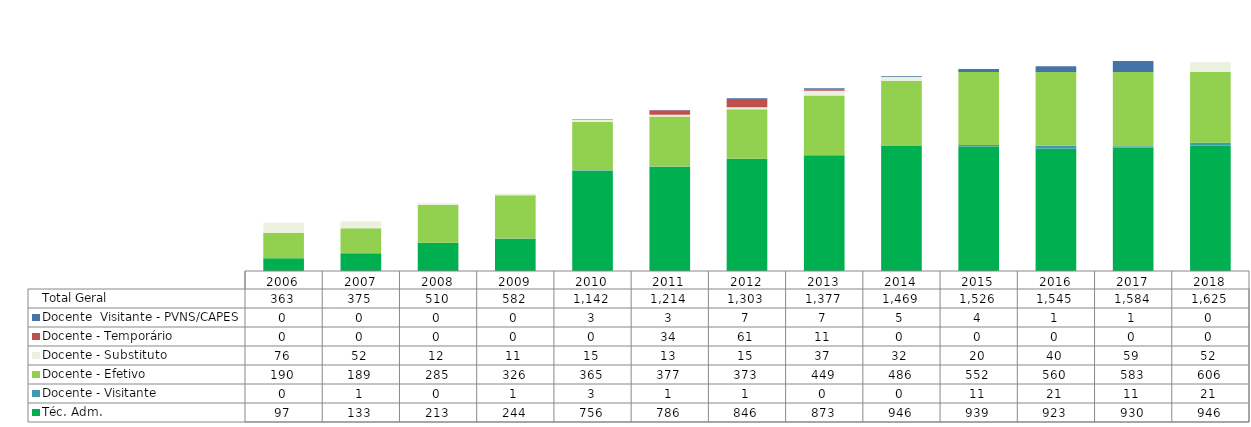
| Category | Téc. Adm. | Docente - Visitante | Docente - Efetivo | Docente - Substituto | Docente - Temporário | Docente  Visitante - PVNS/CAPES  | Total Geral |
|---|---|---|---|---|---|---|---|
| 2006.0 | 97 | 0 | 190 | 76 | 0 | 0 | 363 |
| 2007.0 | 133 | 1 | 189 | 52 | 0 | 0 | 375 |
| 2008.0 | 213 | 0 | 285 | 12 | 0 | 0 | 510 |
| 2009.0 | 244 | 1 | 326 | 11 | 0 | 0 | 582 |
| 2010.0 | 756 | 3 | 365 | 15 | 0 | 3 | 1142 |
| 2011.0 | 786 | 1 | 377 | 13 | 34 | 3 | 1214 |
| 2012.0 | 846 | 1 | 373 | 15 | 61 | 7 | 1303 |
| 2013.0 | 873 | 0 | 449 | 37 | 11 | 7 | 1377 |
| 2014.0 | 946 | 0 | 486 | 32 | 0 | 5 | 1469 |
| 2015.0 | 939 | 11 | 552 | 20 | 0 | 4 | 1526 |
| 2016.0 | 923 | 21 | 560 | 40 | 0 | 1 | 1545 |
| 2017.0 | 930 | 11 | 583 | 59 | 0 | 1 | 1584 |
| 2018.0 | 946 | 21 | 606 | 52 | 0 | 0 | 1625 |